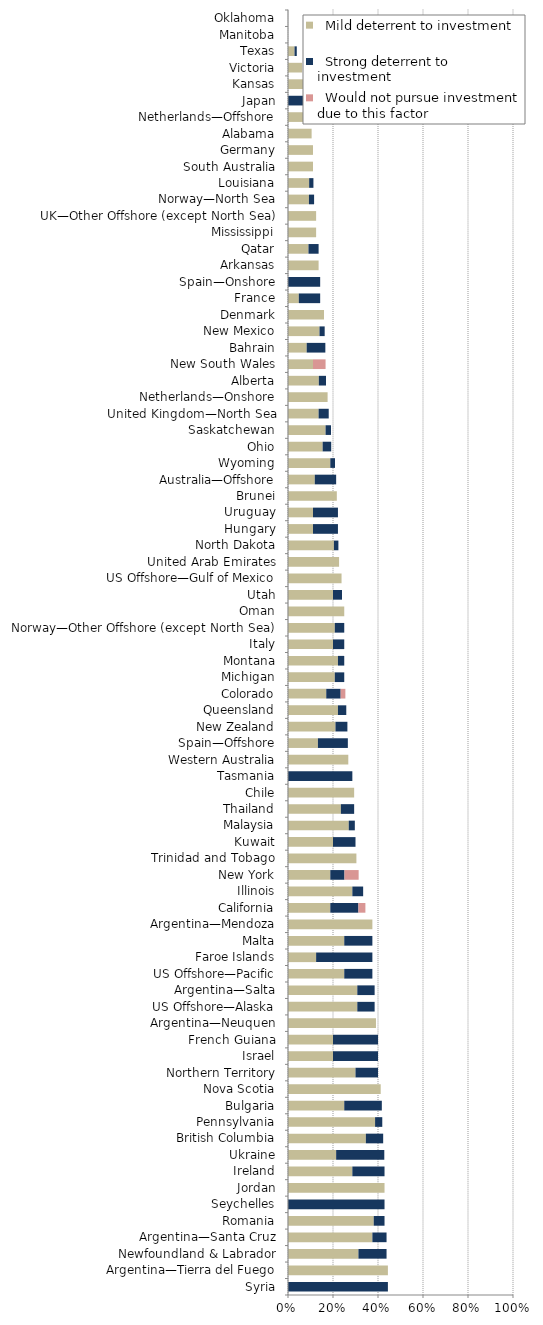
| Category |   Mild deterrent to investment |   Strong deterrent to investment |   Would not pursue investment due to this factor |
|---|---|---|---|
| Syria | 0 | 0.444 | 0 |
| Argentina—Tierra del Fuego | 0.444 | 0 | 0 |
| Newfoundland & Labrador | 0.313 | 0.125 | 0 |
| Argentina—Santa Cruz | 0.375 | 0.063 | 0 |
| Romania | 0.381 | 0.048 | 0 |
| Seychelles | 0 | 0.429 | 0 |
| Jordan | 0.429 | 0 | 0 |
| Ireland | 0.286 | 0.143 | 0 |
| Ukraine | 0.214 | 0.214 | 0 |
| British Columbia | 0.346 | 0.077 | 0 |
| Pennsylvania | 0.387 | 0.032 | 0 |
| Bulgaria | 0.25 | 0.167 | 0 |
| Nova Scotia | 0.412 | 0 | 0 |
| Northern Territory | 0.3 | 0.1 | 0 |
| Israel | 0.2 | 0.2 | 0 |
| French Guiana | 0.2 | 0.2 | 0 |
| Argentina—Neuquen | 0.391 | 0 | 0 |
| US Offshore—Alaska | 0.308 | 0.077 | 0 |
| Argentina—Salta | 0.308 | 0.077 | 0 |
| US Offshore—Pacific | 0.25 | 0.125 | 0 |
| Faroe Islands | 0.125 | 0.25 | 0 |
| Malta | 0.25 | 0.125 | 0 |
| Argentina—Mendoza | 0.375 | 0 | 0 |
| California | 0.188 | 0.125 | 0.031 |
| Illinois | 0.286 | 0.048 | 0 |
| New York | 0.188 | 0.063 | 0.063 |
| Trinidad and Tobago | 0.304 | 0 | 0 |
| Kuwait | 0.2 | 0.1 | 0 |
| Malaysia | 0.27 | 0.027 | 0 |
| Thailand | 0.235 | 0.059 | 0 |
| Chile | 0.294 | 0 | 0 |
| Tasmania | 0 | 0.286 | 0 |
| Western Australia | 0.268 | 0 | 0 |
| Spain—Offshore | 0.133 | 0.133 | 0 |
| New Zealand | 0.211 | 0.053 | 0 |
| Queensland | 0.222 | 0.037 | 0 |
| Colorado | 0.17 | 0.064 | 0.021 |
| Michigan | 0.208 | 0.042 | 0 |
| Montana | 0.222 | 0.028 | 0 |
| Italy | 0.2 | 0.05 | 0 |
| Norway—Other Offshore (except North Sea) | 0.208 | 0.042 | 0 |
| Oman | 0.25 | 0 | 0 |
| Utah | 0.2 | 0.04 | 0 |
| US Offshore—Gulf of Mexico | 0.238 | 0 | 0 |
| United Arab Emirates | 0.227 | 0 | 0 |
| North Dakota | 0.204 | 0.02 | 0 |
| Hungary | 0.111 | 0.111 | 0 |
| Uruguay | 0.111 | 0.111 | 0 |
| Brunei | 0.217 | 0 | 0 |
| Australia—Offshore | 0.119 | 0.095 | 0 |
| Wyoming | 0.188 | 0.021 | 0 |
| Ohio | 0.154 | 0.038 | 0 |
| Saskatchewan | 0.167 | 0.024 | 0 |
| United Kingdom—North Sea | 0.136 | 0.045 | 0 |
| Netherlands—Onshore | 0.176 | 0 | 0 |
| Alberta | 0.137 | 0.032 | 0 |
| New South Wales | 0.111 | 0 | 0.056 |
| Bahrain | 0.083 | 0.083 | 0 |
| New Mexico | 0.14 | 0.023 | 0 |
| Denmark | 0.16 | 0 | 0 |
| France | 0.048 | 0.095 | 0 |
| Spain—Onshore | 0 | 0.143 | 0 |
| Arkansas | 0.136 | 0 | 0 |
| Qatar | 0.091 | 0.045 | 0 |
| Mississippi | 0.125 | 0 | 0 |
| UK—Other Offshore (except North Sea) | 0.125 | 0 | 0 |
| Norway—North Sea | 0.093 | 0.023 | 0 |
| Louisiana | 0.094 | 0.019 | 0 |
| South Australia | 0.111 | 0 | 0 |
| Germany | 0.111 | 0 | 0 |
| Alabama | 0.105 | 0 | 0 |
| Netherlands—Offshore | 0.1 | 0 | 0 |
| Japan | 0 | 0.1 | 0 |
| Kansas | 0.086 | 0 | 0 |
| Victoria | 0.063 | 0 | 0 |
| Texas | 0.029 | 0.01 | 0 |
| Manitoba | 0 | 0 | 0 |
| Oklahoma | 0 | 0 | 0 |